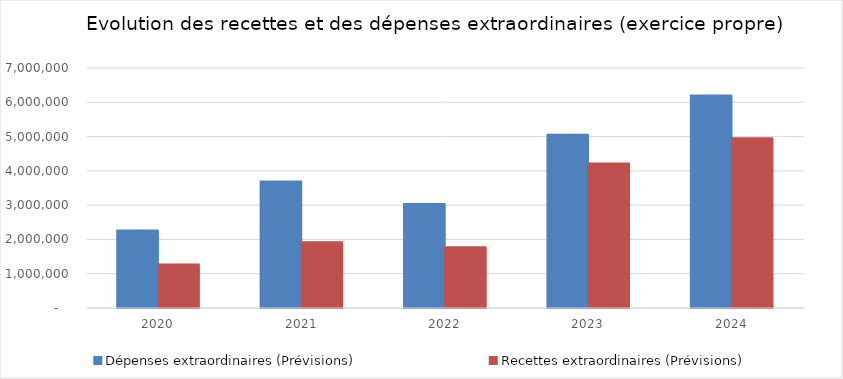
| Category | Dépenses extraordinaires (Prévisions) | Recettes extraordinaires (Prévisions) |
|---|---|---|
| 2020.0 | 2245157 | 1253524.59 |
| 2021.0 | 3674350 | 1902400 |
| 2022.0 | 3020547.78 | 1755322.78 |
| 2023.0 | 5037362.78 | 4200922.78 |
| 2024.0 | 6185473.73 | 4937422.42 |